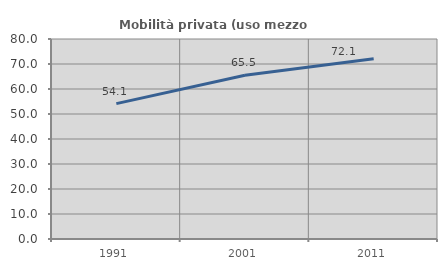
| Category | Mobilità privata (uso mezzo privato) |
|---|---|
| 1991.0 | 54.146 |
| 2001.0 | 65.465 |
| 2011.0 | 72.077 |